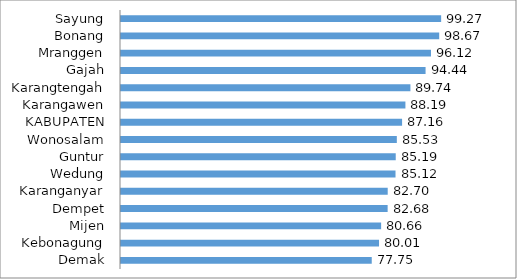
| Category | Series 0 |
|---|---|
| Demak | 77.75 |
| Kebonagung | 80.01 |
| Mijen | 80.66 |
| Dempet | 82.68 |
| Karanganyar | 82.7 |
| Wedung | 85.12 |
| Guntur | 85.19 |
| Wonosalam | 85.53 |
| KABUPATEN | 87.16 |
| Karangawen | 88.19 |
| Karangtengah | 89.74 |
| Gajah | 94.44 |
| Mranggen | 96.12 |
| Bonang | 98.67 |
| Sayung | 99.27 |